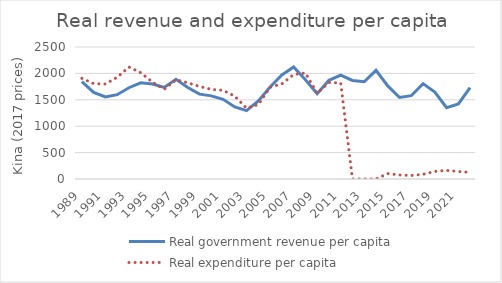
| Category | Real government revenue per capita | Real expenditure per capita |
|---|---|---|
| 1989.0 | 1842.109 | 1906.062 |
| 1990.0 | 1640.271 | 1806.471 |
| 1991.0 | 1554.348 | 1799.117 |
| 1992.0 | 1596.916 | 1927.224 |
| 1993.0 | 1728.537 | 2120.023 |
| 1994.0 | 1821.312 | 2014.27 |
| 1995.0 | 1798.568 | 1833.461 |
| 1996.0 | 1733.456 | 1699.75 |
| 1997.0 | 1887.909 | 1879.678 |
| 1998.0 | 1733.101 | 1823.185 |
| 1999.0 | 1607.72 | 1753.097 |
| 2000.0 | 1574.835 | 1696.766 |
| 2001.0 | 1509.395 | 1679.728 |
| 2002.0 | 1364.879 | 1567.551 |
| 2003.0 | 1294.948 | 1339.046 |
| 2004.0 | 1479.969 | 1411.306 |
| 2005.0 | 1741.466 | 1738.949 |
| 2006.0 | 1969.56 | 1802.362 |
| 2007.0 | 2121.908 | 1978.145 |
| 2008.0 | 1880.934 | 2008.176 |
| 2009.0 | 1615.317 | 1624.036 |
| 2010.0 | 1869.623 | 1827.551 |
| 2011.0 | 1968.435 | 1816.945 |
| 2012.0 | 1866.407 | 0 |
| 2013.0 | 1841.698 | 0 |
| 2014.0 | 2058.138 | 0 |
| 2015.0 | 1763.358 | 101.925 |
| 2016.0 | 1543.668 | 76.112 |
| 2017.0 | 1578.069 | 66.997 |
| 2018.0 | 1806.002 | 87.703 |
| 2019.0 | 1647.688 | 143.156 |
| 2020.0 | 1350.96 | 163.657 |
| 2021.0 | 1422.686 | 141.587 |
| 2022.0 | 1729.786 | 124.745 |